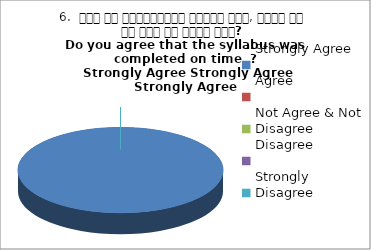
| Category | 6.  समय पर पाठ्यक्रम पूर्ण हुआ, क्या आप इस बात से सहमत हैं? 
Do you agree that the syllabus was completed on time  ?
 Strongly Agree Strongly Agree Strongly Agree |
|---|---|
| Strongly Agree | 3 |
| Agree | 0 |
| Not Agree & Not Disagree | 0 |
| Disagree | 0 |
| Strongly Disagree | 0 |